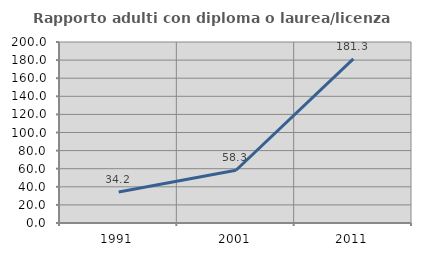
| Category | Rapporto adulti con diploma o laurea/licenza media  |
|---|---|
| 1991.0 | 34.183 |
| 2001.0 | 58.272 |
| 2011.0 | 181.301 |